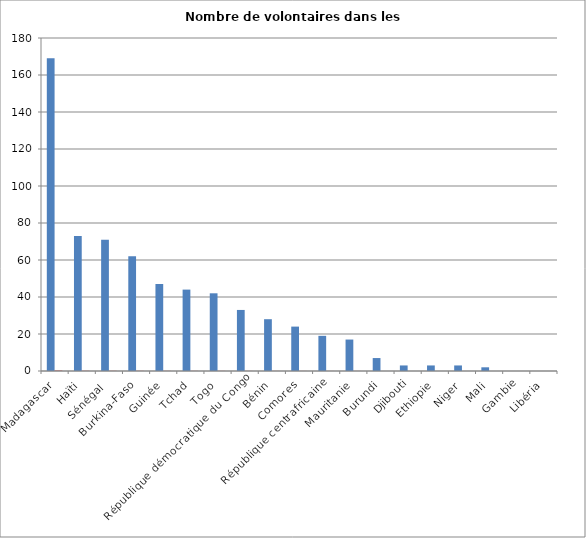
| Category | Nombre de volontaires | % |
|---|---|---|
| Madagascar | 169 | 0.261 |
| Haïti | 73 | 0.113 |
| Sénégal  | 71 | 0.11 |
| Burkina-Faso | 62 | 0.096 |
| Guinée | 47 | 0.073 |
| Tchad | 44 | 0.068 |
| Togo | 42 | 0.065 |
| République démocratique du Congo | 33 | 0.051 |
| Bénin | 28 | 0.043 |
| Comores | 24 | 0.037 |
| République centrafricaine | 19 | 0.029 |
| Mauritanie | 17 | 0.026 |
| Burundi | 7 | 0.011 |
| Djibouti | 3 | 0.005 |
| Ethiopie | 3 | 0.005 |
| Niger | 3 | 0.005 |
| Mali | 2 | 0.003 |
| Gambie | 0 | 0 |
| Libéria | 0 | 0 |